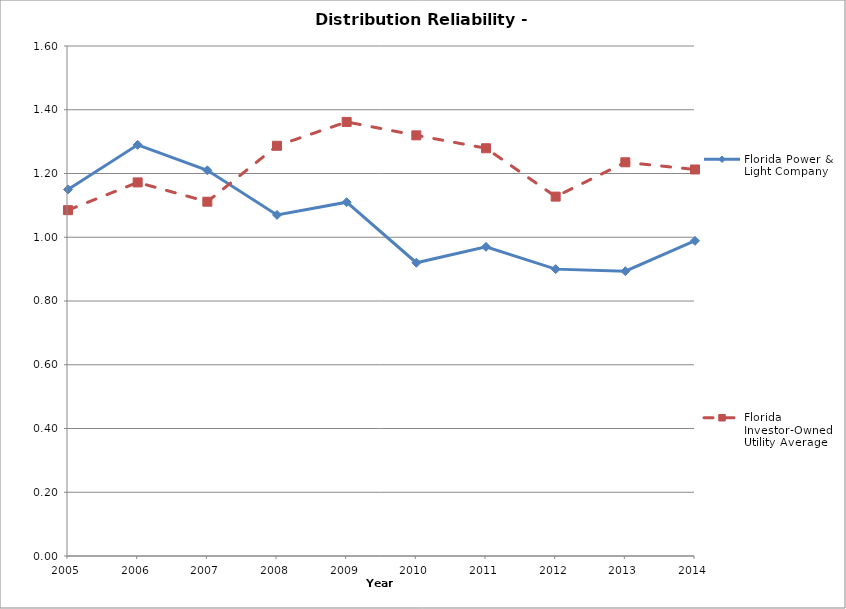
| Category | Florida Power & Light Company | Florida Investor-Owned Utility Average |
|---|---|---|
| 2005.0 | 1.15 | 1.085 |
| 2006.0 | 1.29 | 1.172 |
| 2007.0 | 1.21 | 1.112 |
| 2008.0 | 1.07 | 1.287 |
| 2009.0 | 1.11 | 1.362 |
| 2010.0 | 0.92 | 1.32 |
| 2011.0 | 0.97 | 1.279 |
| 2012.0 | 0.9 | 1.128 |
| 2013.0 | 0.894 | 1.235 |
| 2014.0 | 0.989 | 1.213 |